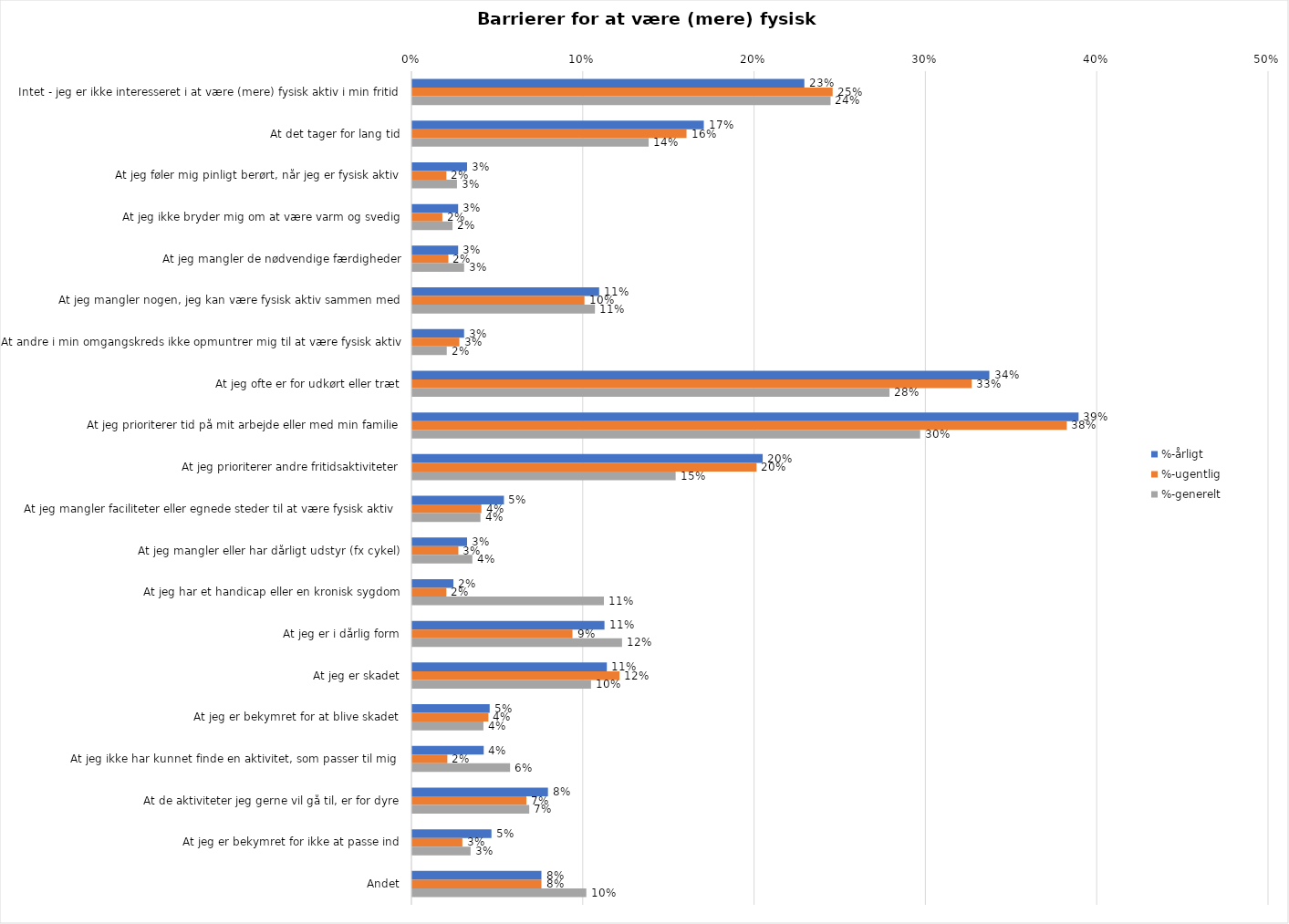
| Category | %-årligt | %-ugentlig | %-generelt |
|---|---|---|---|
| Intet - jeg er ikke interesseret i at være (mere) fysisk aktiv i min fritid | 0.229 | 0.245 | 0.244 |
| At det tager for lang tid | 0.17 | 0.16 | 0.138 |
| At jeg føler mig pinligt berørt, når jeg er fysisk aktiv | 0.032 | 0.02 | 0.026 |
| At jeg ikke bryder mig om at være varm og svedig | 0.027 | 0.018 | 0.023 |
| At jeg mangler de nødvendige færdigheder | 0.027 | 0.021 | 0.03 |
| At jeg mangler nogen, jeg kan være fysisk aktiv sammen med | 0.109 | 0.1 | 0.107 |
| At andre i min omgangskreds ikke opmuntrer mig til at være fysisk aktiv | 0.03 | 0.027 | 0.02 |
| At jeg ofte er for udkørt eller træt | 0.337 | 0.327 | 0.279 |
| At jeg prioriterer tid på mit arbejde eller med min familie | 0.389 | 0.382 | 0.296 |
| At jeg prioriterer andre fritidsaktiviteter | 0.205 | 0.201 | 0.154 |
| At jeg mangler faciliteter eller egnede steder til at være fysisk aktiv  | 0.053 | 0.04 | 0.04 |
| At jeg mangler eller har dårligt udstyr (fx cykel) | 0.032 | 0.027 | 0.035 |
| At jeg har et handicap eller en kronisk sygdom | 0.024 | 0.02 | 0.112 |
| At jeg er i dårlig form | 0.112 | 0.093 | 0.122 |
| At jeg er skadet | 0.114 | 0.121 | 0.104 |
| At jeg er bekymret for at blive skadet | 0.045 | 0.044 | 0.041 |
| At jeg ikke har kunnet finde en aktivitet, som passer til mig  | 0.042 | 0.02 | 0.057 |
| At de aktiviteter jeg gerne vil gå til, er for dyre | 0.079 | 0.067 | 0.068 |
| At jeg er bekymret for ikke at passe ind | 0.046 | 0.029 | 0.034 |
| Andet | 0.075 | 0.075 | 0.102 |